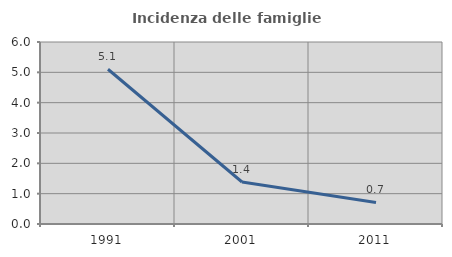
| Category | Incidenza delle famiglie numerose |
|---|---|
| 1991.0 | 5.102 |
| 2001.0 | 1.384 |
| 2011.0 | 0.709 |